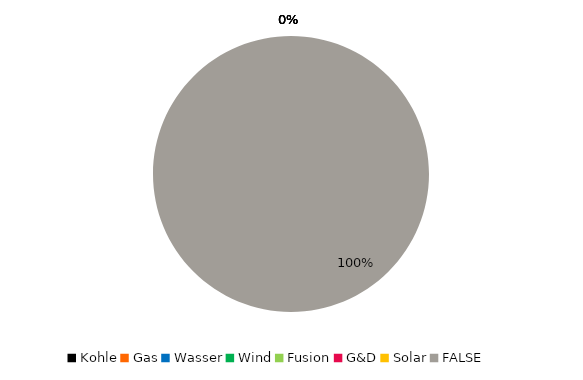
| Category | Kohle Gas Wasser Wind Fusion G&D Solar |
|---|---|
| Kohle | 0 |
| Gas | 0 |
| Wasser | 0 |
| Wind | 0 |
| Fusion | 0 |
| G&D | 0 |
| Solar | 0 |
| FALSE | 1 |